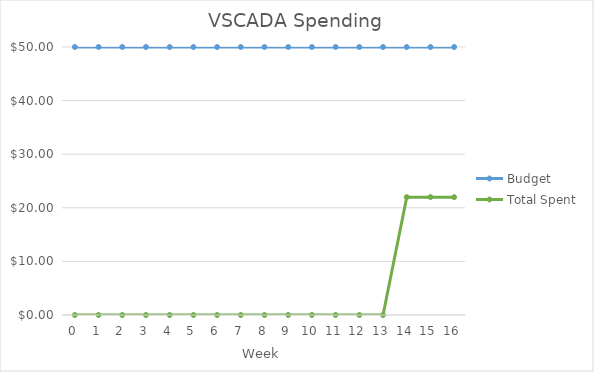
| Category | Budget | Total Spent |
|---|---|---|
| 0.0 | 50 | 0 |
| 1.0 | 50 | 0 |
| 2.0 | 50 | 0 |
| 3.0 | 50 | 0 |
| 4.0 | 50 | 0 |
| 5.0 | 50 | 0 |
| 6.0 | 50 | 0 |
| 7.0 | 50 | 0 |
| 8.0 | 50 | 0 |
| 9.0 | 50 | 0 |
| 10.0 | 50 | 0 |
| 11.0 | 50 | 0 |
| 12.0 | 50 | 0 |
| 13.0 | 50 | 0 |
| 14.0 | 50 | 21.99 |
| 15.0 | 50 | 21.99 |
| 16.0 | 50 | 21.99 |